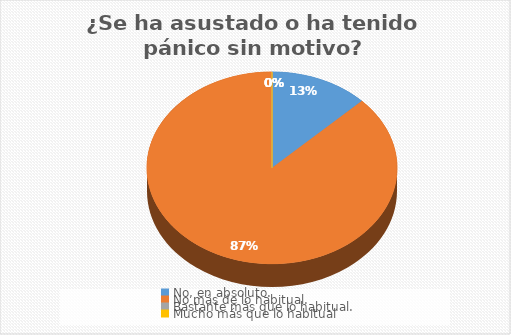
| Category | ¿ Se ha asustado o ha tenido pánico sin motivo? |
|---|---|
| No, en absoluto. | 14 |
| No más de lo habitual. | 96 |
| Bastante más que lo habitual. | 0 |
| Mucho más que lo habitual | 0 |